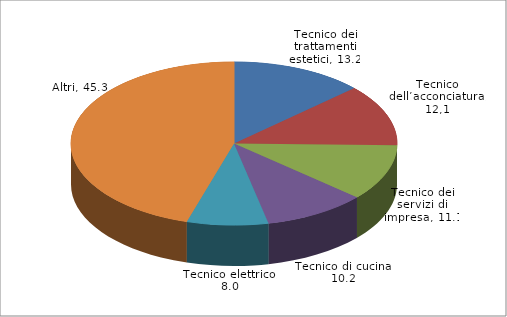
| Category | Series 0 |
|---|---|
| Tecnico dei trattamenti estetici | 13.164 |
| Tecnico dell’acconciatura | 12.15 |
| Tecnico dei servizi di impresa | 11.114 |
| Tecnico di cucina | 10.187 |
| Tecnico elettrico | 8.049 |
| Altri | 45.336 |